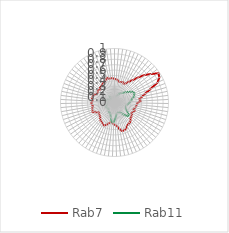
| Category | Rab7 | Rab11 |
|---|---|---|
| 0.0 | 0.434 | 0.089 |
| 0.10913 | 0.433 | 0.096 |
| 0.21825 | 0.416 | 0.113 |
| 0.32738 | 0.392 | 0.113 |
| 0.43651 | 0.396 | 0.127 |
| 0.54563 | 0.41 | 0.141 |
| 0.65476 | 0.383 | 0.16 |
| 0.76389 | 0.413 | 0.199 |
| 0.87302 | 0.47 | 0.216 |
| 0.98214 | 0.534 | 0.233 |
| 1.09127 | 0.639 | 0.25 |
| 1.2004 | 0.758 | 0.283 |
| 1.30952 | 0.858 | 0.314 |
| 1.41865 | 0.977 | 0.362 |
| 1.52778 | 0.952 | 0.389 |
| 1.6369 | 0.881 | 0.406 |
| 1.74603 | 0.711 | 0.389 |
| 1.85516 | 0.595 | 0.371 |
| 1.96429 | 0.52 | 0.331 |
| 2.07341 | 0.462 | 0.315 |
| 2.18254 | 0.483 | 0.296 |
| 2.29167 | 0.425 | 0.271 |
| 2.40079 | 0.414 | 0.257 |
| 2.50992 | 0.407 | 0.249 |
| 2.61905 | 0.394 | 0.223 |
| 2.72817 | 0.364 | 0.228 |
| 2.8373 | 0.406 | 0.229 |
| 2.94643 | 0.377 | 0.233 |
| 3.05556 | 0.365 | 0.256 |
| 3.16468 | 0.395 | 0.294 |
| 3.27381 | 0.406 | 0.345 |
| 3.38294 | 0.415 | 0.356 |
| 3.49206 | 0.45 | 0.323 |
| 3.60119 | 0.469 | 0.276 |
| 3.71032 | 0.474 | 0.231 |
| 3.81944 | 0.485 | 0.208 |
| 3.92857 | 0.537 | 0.205 |
| 4.0377 | 0.541 | 0.191 |
| 4.14683 | 0.55 | 0.189 |
| 4.25595 | 0.506 | 0.211 |
| 4.36508 | 0.446 | 0.252 |
| 4.47421 | 0.418 | 0.305 |
| 4.58333 | 0.407 | 0.359 |
| 4.69246 | 0.369 | 0.367 |
| 4.80159 | 0.373 | 0.325 |
| 4.91071 | 0.401 | 0.267 |
| 5.01984 | 0.436 | 0.229 |
| 5.12897 | 0.466 | 0.21 |
| 5.2381 | 0.458 | 0.2 |
| 5.34722 | 0.433 | 0.199 |
| 5.45635 | 0.428 | 0.181 |
| 5.56548 | 0.399 | 0.18 |
| 5.6746 | 0.372 | 0.158 |
| 5.78373 | 0.363 | 0.153 |
| 5.89286 | 0.349 | 0.166 |
| 6.00198 | 0.343 | 0.161 |
| 6.11111 | 0.399 | 0.173 |
| 6.22024 | 0.444 | 0.168 |
| 6.32937 | 0.429 | 0.159 |
| 6.43849 | 0.425 | 0.135 |
| 6.54762 | 0.405 | 0.12 |
| 6.65675 | 0.417 | 0.111 |
| 6.76587 | 0.431 | 0.102 |
| 6.875 | 0.41 | 0.108 |
| 6.98413 | 0.412 | 0.126 |
| 7.09325 | 0.43 | 0.145 |
| 7.20238 | 0.412 | 0.166 |
| 7.31151 | 0.422 | 0.167 |
| 7.42063 | 0.36 | 0.136 |
| 7.52976 | 0.364 | 0.087 |
| 7.63889 | 0.369 | 0.062 |
| 7.74802 | 0.376 | 0.054 |
| 7.85714 | 0.357 | 0.076 |
| 7.96627 | 0.391 | 0.099 |
| 8.0754 | 0.392 | 0.128 |
| 8.18452 | 0.401 | 0.127 |
| 8.29365 | 0.426 | 0.102 |
| 8.40278 | 0.423 | 0.106 |
| 8.5119 | 0.446 | 0.105 |
| 8.62103 | 0.478 | 0.097 |
| 8.73016 | 0.452 | 0.088 |
| 8.83929 | 0.453 | 0.097 |
| 8.94841 | 0.452 | 0.097 |